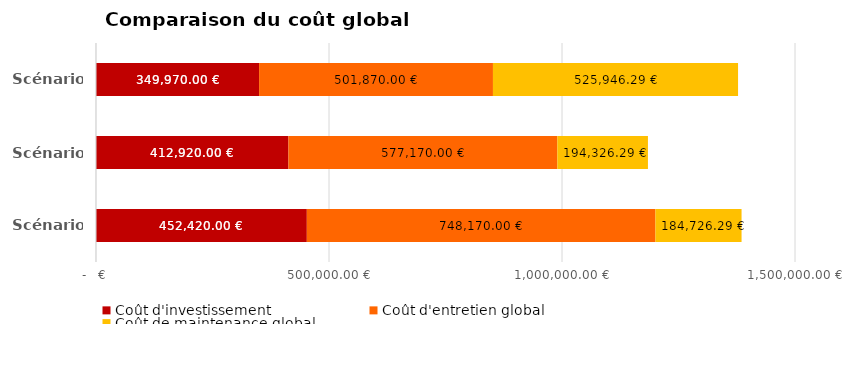
| Category | Coût d'investissement | Coût d'entretien global | Coût de maintenance global |
|---|---|---|---|
| Scénario 1 | 452420 | 748170 | 184726.29 |
| Scénario 2 | 412920 | 577170 | 194326.29 |
| Scénario 3 | 349970 | 501870 | 525946.29 |